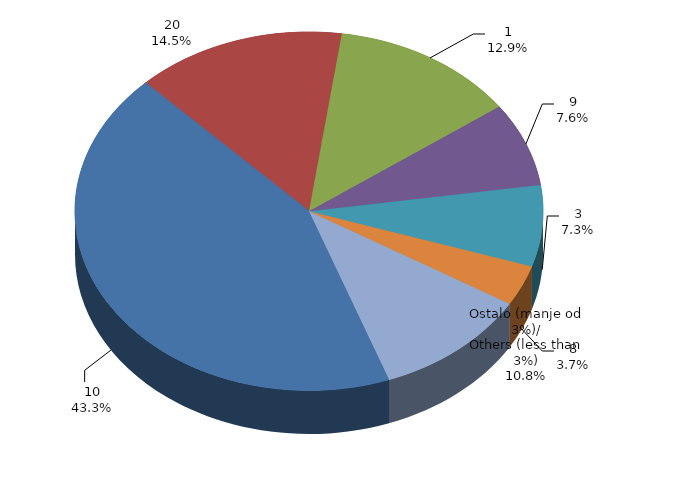
| Category | Series 0 | Series 1 |
|---|---|---|
| 10 | 31209253.148 | 0.433 |
| 20 | 10490601.511 | 0.145 |
| 1 | 9272273.86 | 0.129 |
| 9 | 5466773.634 | 0.076 |
| 3 | 5280477.182 | 0.073 |
| 8 | 2640314.267 | 0.037 |
| Ostalo (manje od 3%)/
Others (less than 3%) | 7793190.965 | 0.108 |